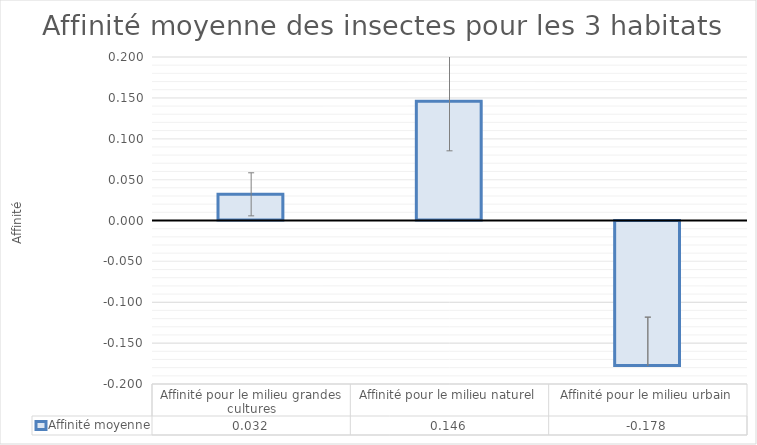
| Category | Affinité moyenne |
|---|---|
| Affinité pour le milieu grandes cultures | 0.032 |
| Affinité pour le milieu naturel | 0.146 |
| Affinité pour le milieu urbain | -0.178 |